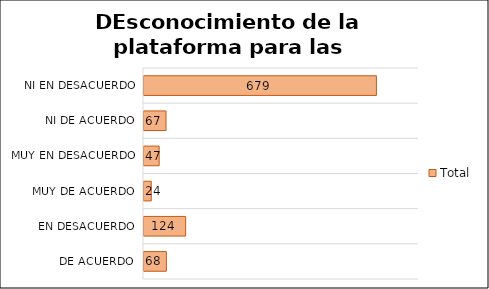
| Category | Total |
|---|---|
| De acuerdo | 68 |
| En desacuerdo | 124 |
| Muy de Acuerdo | 24 |
| Muy en desacuerdo | 47 |
| Ni de acuerdo, ni en desacuerdo | 67 |
| No responde | 679 |